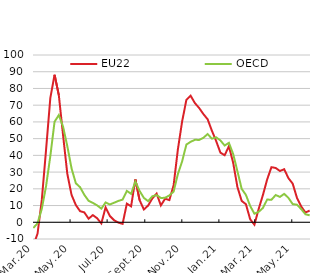
| Category | EU22 | OECD |
|---|---|---|
| 2020-03-02 | -13.982 | -3.417 |
| 2020-03-09 | -6.777 | -0.594 |
| 2020-03-16 | 13.348 | 8.063 |
| 2020-03-23 | 43.284 | 21.566 |
| 2020-03-30 | 74.263 | 39.5 |
| 2020-04-06 | 88.173 | 60.124 |
| 2020-04-13 | 76.015 | 64.088 |
| 2020-04-20 | 52.05 | 57.199 |
| 2020-04-27 | 28.904 | 45.446 |
| 2020-05-04 | 16.339 | 32.152 |
| 2020-05-11 | 10.305 | 23.33 |
| 2020-05-18 | 6.632 | 20.96 |
| 2020-05-25 | 5.914 | 16.38 |
| 2020-06-01 | 2.126 | 12.836 |
| 2020-06-08 | 4.271 | 11.609 |
| 2020-06-15 | 2.429 | 10.113 |
| 2020-06-22 | -0.68 | 8.148 |
| 2020-06-29 | 8.917 | 11.844 |
| 2020-07-06 | 3.771 | 10.646 |
| 2020-07-13 | 1.227 | 11.684 |
| 2020-07-20 | -0.201 | 12.759 |
| 2020-07-27 | -0.941 | 13.547 |
| 2020-08-03 | 11.132 | 18.749 |
| 2020-08-10 | 9.524 | 17 |
| 2020-08-17 | 25.65 | 24.305 |
| 2020-08-24 | 13.244 | 18.743 |
| 2020-08-31 | 7.65 | 14.581 |
| 2020-09-07 | 9.983 | 12.612 |
| 2020-09-14 | 14.272 | 15.547 |
| 2020-09-21 | 17.139 | 16.231 |
| 2020-09-28 | 10.089 | 14.513 |
| 2020-10-05 | 14.087 | 14.644 |
| 2020-10-12 | 13.269 | 16.068 |
| 2020-10-19 | 22.179 | 18.328 |
| 2020-10-26 | 43.561 | 28.841 |
| 2020-11-02 | 60.263 | 36.43 |
| 2020-11-09 | 73.178 | 46.463 |
| 2020-11-16 | 75.644 | 48.1 |
| 2020-11-23 | 71.263 | 49.299 |
| 2020-11-30 | 68.313 | 49.228 |
| 2020-12-07 | 64.687 | 50.515 |
| 2020-12-14 | 61.559 | 52.73 |
| 2020-12-21 | 54.716 | 49.965 |
| 2020-12-28 | 48.584 | 50.8 |
| 2021-01-04 | 41.636 | 48.924 |
| 2021-01-11 | 40.066 | 45.886 |
| 2021-01-18 | 45.44 | 47.49 |
| 2021-01-25 | 35.594 | 40.822 |
| 2021-02-01 | 21.112 | 30.561 |
| 2021-02-08 | 12.786 | 20.017 |
| 2021-02-15 | 10.801 | 16.35 |
| 2021-02-22 | 1.804 | 9.757 |
| 2021-03-01 | -1.461 | 5.115 |
| 2021-03-08 | 7.982 | 6.241 |
| 2021-03-15 | 16.3 | 8.54 |
| 2021-03-22 | 25.624 | 13.59 |
| 2021-03-29 | 32.939 | 13.446 |
| 2021-04-05 | 32.465 | 16.284 |
| 2021-04-12 | 30.653 | 15.17 |
| 2021-04-19 | 31.726 | 16.983 |
| 2021-04-26 | 26.36 | 14.556 |
| 2021-05-03 | 23.106 | 10.869 |
| 2021-05-10 | 14.643 | 10.499 |
| 2021-05-17 | 9.467 | 7.905 |
| 2021-05-24 | 5.822 | 4.798 |
| 2021-05-31 | 7.006 | 4.144 |